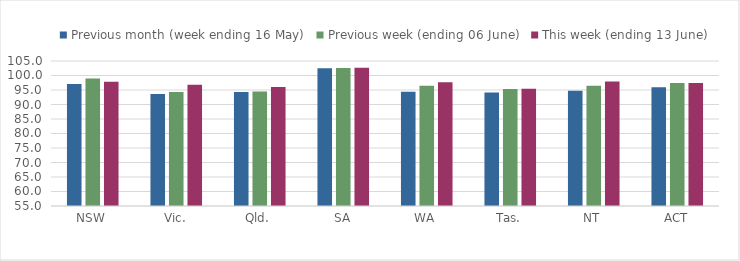
| Category | Previous month (week ending 16 May) | Previous week (ending 06 June) | This week (ending 13 June) |
|---|---|---|---|
| NSW | 97.111 | 98.988 | 97.803 |
| Vic. | 93.635 | 94.287 | 96.814 |
| Qld. | 94.286 | 94.451 | 96.05 |
| SA | 102.474 | 102.573 | 102.702 |
| WA | 94.418 | 96.425 | 97.635 |
| Tas. | 94.158 | 95.349 | 95.404 |
| NT | 94.761 | 96.496 | 97.892 |
| ACT | 95.935 | 97.435 | 97.448 |